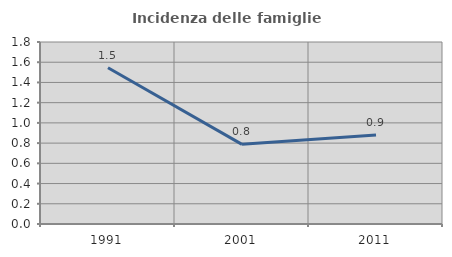
| Category | Incidenza delle famiglie numerose |
|---|---|
| 1991.0 | 1.545 |
| 2001.0 | 0.788 |
| 2011.0 | 0.88 |